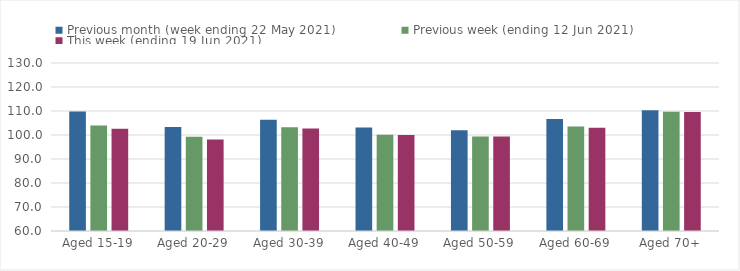
| Category | Previous month (week ending 22 May 2021) | Previous week (ending 12 Jun 2021) | This week (ending 19 Jun 2021) |
|---|---|---|---|
| Aged 15-19 | 109.8 | 103.99 | 102.61 |
| Aged 20-29 | 103.3 | 99.26 | 98.17 |
| Aged 30-39 | 106.36 | 103.23 | 102.69 |
| Aged 40-49 | 103.17 | 100.12 | 99.96 |
| Aged 50-59 | 102 | 99.37 | 99.41 |
| Aged 60-69 | 106.7 | 103.58 | 103.05 |
| Aged 70+ | 110.29 | 109.66 | 109.61 |